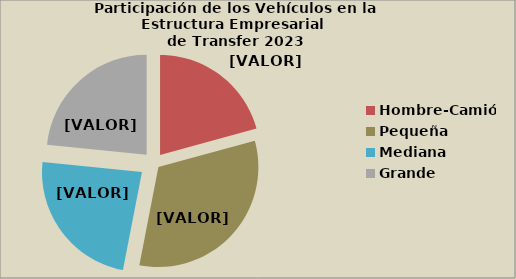
| Category | Series 0 |
|---|---|
| Hombre-Camión | 20.742 |
| Pequeña | 32.307 |
| Mediana | 23.555 |
| Grande | 23.397 |